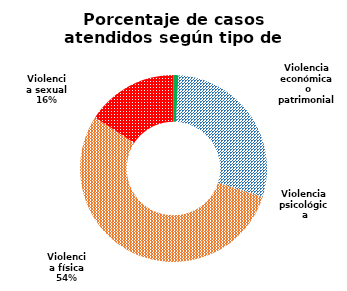
| Category | Series 0 |
|---|---|
| Violencia económica o patrimonial | 37 |
| Violencia psicológica | 1263 |
| Violencia física | 2358 |
| Violencia sexual | 688 |